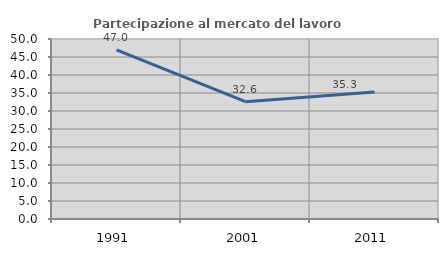
| Category | Partecipazione al mercato del lavoro  femminile |
|---|---|
| 1991.0 | 46.97 |
| 2001.0 | 32.584 |
| 2011.0 | 35.294 |